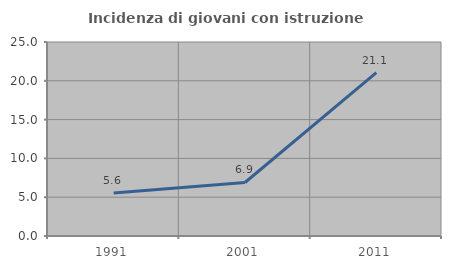
| Category | Incidenza di giovani con istruzione universitaria |
|---|---|
| 1991.0 | 5.556 |
| 2001.0 | 6.897 |
| 2011.0 | 21.053 |